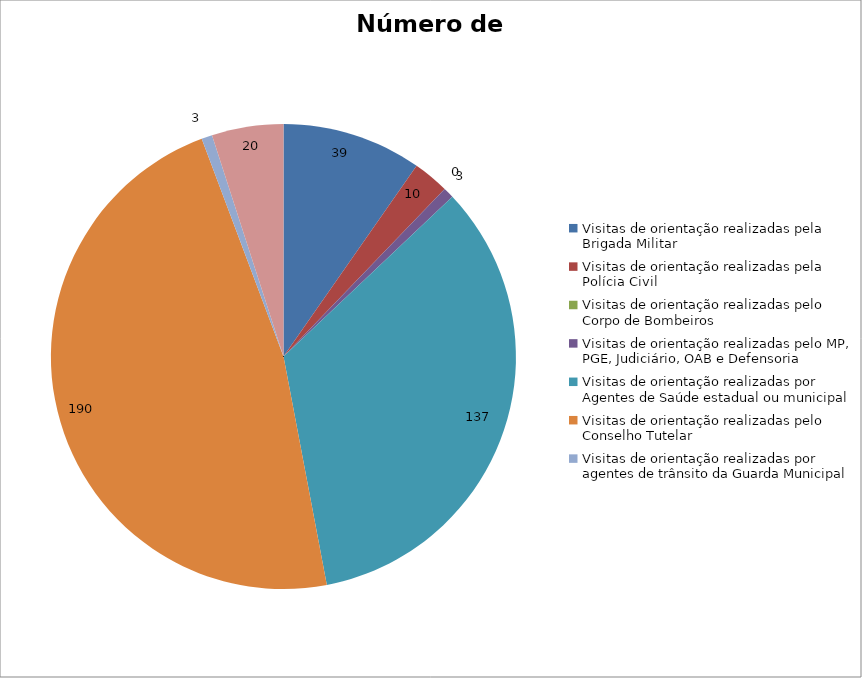
| Category | Número de Ações |
|---|---|
| Visitas de orientação realizadas pela Brigada Militar | 39 |
| Visitas de orientação realizadas pela Polícia Civil | 10 |
| Visitas de orientação realizadas pelo Corpo de Bombeiros | 0 |
| Visitas de orientação realizadas pelo MP, PGE, Judiciário, OAB e Defensoria | 3 |
| Visitas de orientação realizadas por Agentes de Saúde estadual ou municipal | 137 |
| Visitas de orientação realizadas pelo Conselho Tutelar | 190 |
| Visitas de orientação realizadas por agentes de trânsito da Guarda Municipal | 3 |
| Visitas de orientação realizadas por ONGs, entidades privadas, CRAS e CREAS | 20 |